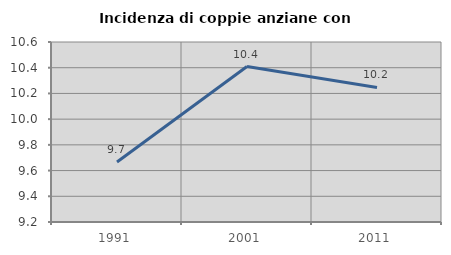
| Category | Incidenza di coppie anziane con figli |
|---|---|
| 1991.0 | 9.667 |
| 2001.0 | 10.409 |
| 2011.0 | 10.247 |